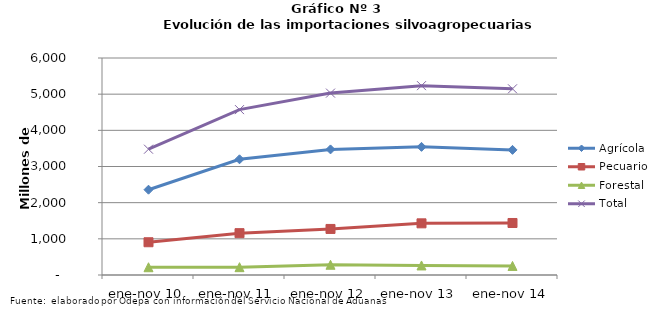
| Category | Agrícola | Pecuario | Forestal | Total |
|---|---|---|---|---|
| ene-nov 10 | 2358018 | 905556 | 214868 | 3478442 |
| ene-nov 11 | 3199231 | 1156782 | 216607 | 4572620 |
| ene-nov 12 | 3472518 | 1273582 | 283268 | 5029368 |
| ene-nov 13 | 3542711 | 1428430 | 264390 | 5235531 |
| ene-nov 14 | 3459259 | 1437832 | 250696 | 5147787 |